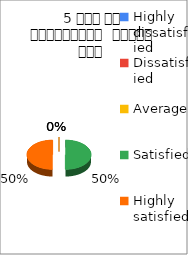
| Category | 5 समय पर पाठ्यक्रम  पूर्ण हुआ  |
|---|---|
| Highly dissatisfied | 0 |
| Dissatisfied | 0 |
| Average | 0 |
| Satisfied | 3 |
| Highly satisfied | 3 |